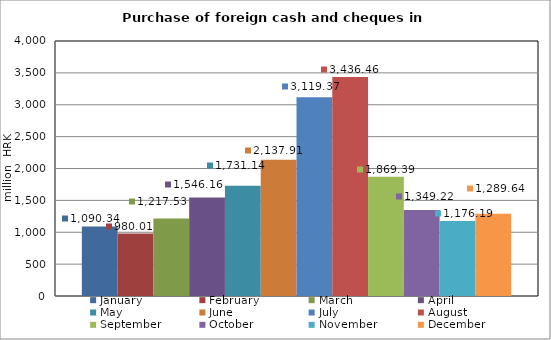
| Category | January | February | March | April | May | June | July | August | September | October | November | December |
|---|---|---|---|---|---|---|---|---|---|---|---|---|
| 0 | 1090.34 | 980.012 | 1217.532 | 1546.16 | 1731.143 | 2137.911 | 3119.366 | 3436.46 | 1869.386 | 1349.218 | 1176.185 | 1289.643 |